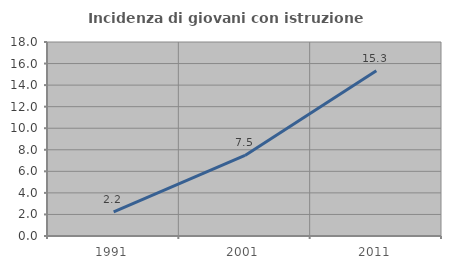
| Category | Incidenza di giovani con istruzione universitaria |
|---|---|
| 1991.0 | 2.232 |
| 2001.0 | 7.473 |
| 2011.0 | 15.331 |